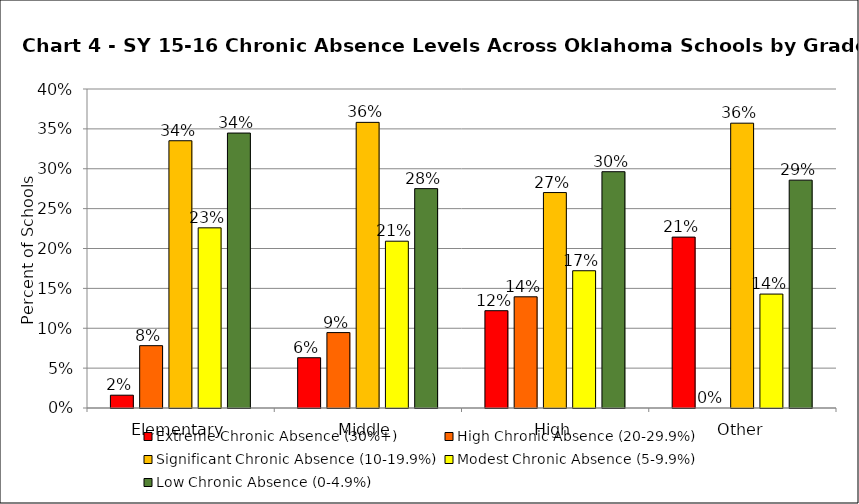
| Category | Extreme Chronic Absence (30%+) | High Chronic Absence (20-29.9%) | Significant Chronic Absence (10-19.9%) | Modest Chronic Absence (5-9.9%) | Low Chronic Absence (0-4.9%) |
|---|---|---|---|---|---|
| 0 | 0.016 | 0.078 | 0.335 | 0.226 | 0.345 |
| 1 | 0.063 | 0.095 | 0.358 | 0.209 | 0.275 |
| 2 | 0.122 | 0.139 | 0.27 | 0.172 | 0.296 |
| 3 | 0.214 | 0 | 0.357 | 0.143 | 0.286 |